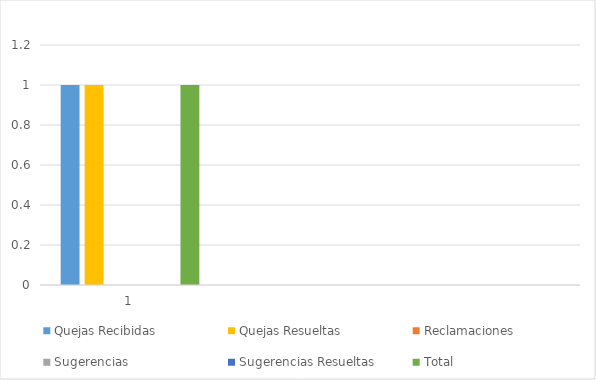
| Category | Quejas Recibidas | Quejas Resueltas | Reclamaciones | Sugerencias | Sugerencias Resueltas | Total |
|---|---|---|---|---|---|---|
| 1.0 | 1 | 1 | 0 | 0 | 0 | 1 |